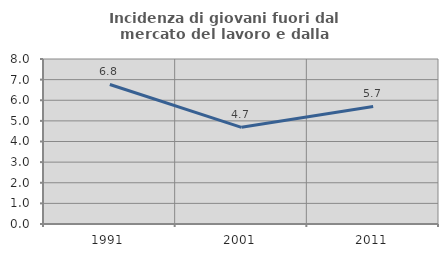
| Category | Incidenza di giovani fuori dal mercato del lavoro e dalla formazione  |
|---|---|
| 1991.0 | 6.765 |
| 2001.0 | 4.688 |
| 2011.0 | 5.699 |